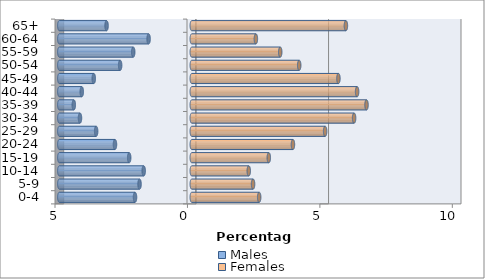
| Category | Males | Females |
|---|---|---|
| 0-4 | -2.143 | 2.544 |
| 5-9 | -1.972 | 2.314 |
| 10-14 | -1.815 | 2.151 |
| 15-19 | -2.363 | 2.908 |
| 20-24 | -2.9 | 3.819 |
| 25-29 | -3.61 | 5.035 |
| 30-34 | -4.221 | 6.128 |
| 35-39 | -4.454 | 6.597 |
| 40-44 | -4.153 | 6.242 |
| 45-49 | -3.7 | 5.536 |
| 50-54 | -2.704 | 4.055 |
| 55-59 | -2.211 | 3.339 |
| 60-64 | -1.63 | 2.42 |
| 65+ | -3.217 | 5.819 |